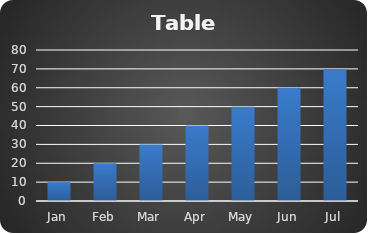
| Category | Sales |
|---|---|
| Jan | 10 |
| Feb | 20 |
| Mar | 30 |
| Apr | 40 |
| May | 50 |
| Jun | 60 |
| Jul | 70 |